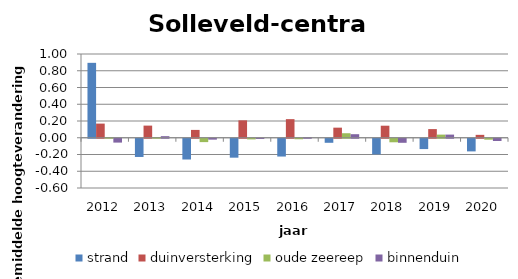
| Category | strand | duinversterking | oude zeereep | binnenduin |
|---|---|---|---|---|
| 2012.0 | 0.894 | 0.169 | 0.008 | -0.046 |
| 2013.0 | -0.218 | 0.145 | 0.009 | 0.019 |
| 2014.0 | -0.248 | 0.094 | -0.04 | -0.011 |
| 2015.0 | -0.226 | 0.208 | -0.008 | -0.002 |
| 2016.0 | -0.212 | 0.222 | -0.006 | 0.008 |
| 2017.0 | -0.048 | 0.121 | 0.054 | 0.042 |
| 2018.0 | -0.187 | 0.144 | -0.042 | -0.048 |
| 2019.0 | -0.123 | 0.103 | 0.038 | 0.038 |
| 2020.0 | -0.151 | 0.035 | -0.011 | -0.027 |